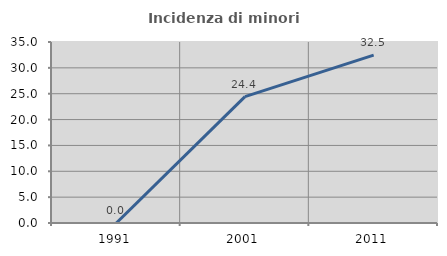
| Category | Incidenza di minori stranieri |
|---|---|
| 1991.0 | 0 |
| 2001.0 | 24.444 |
| 2011.0 | 32.46 |